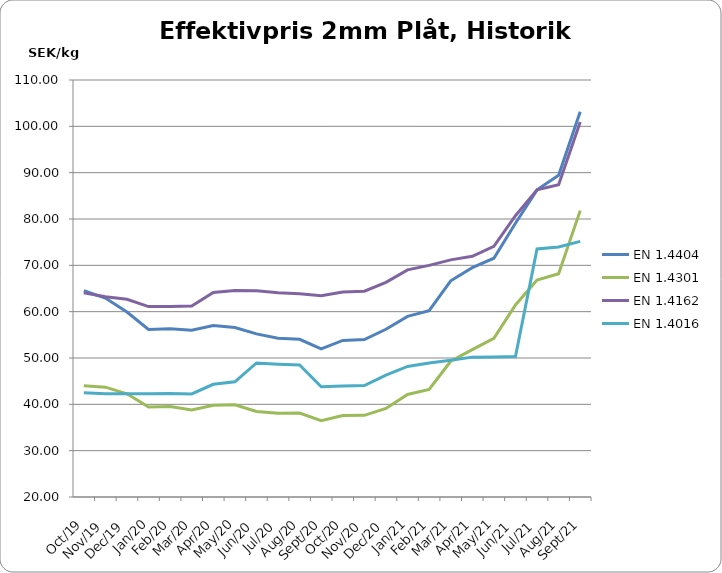
| Category | EN 1.4404 | EN 1.4301 | EN 1.4162  | EN 1.4016 |
|---|---|---|---|---|
| 2019-10-01 | 64.51 | 44.02 | 64.06 | 42.48 |
| 2019-11-01 | 62.95 | 43.71 | 63.23 | 42.31 |
| 2019-12-01 | 59.92 | 42.28 | 62.66 | 42.27 |
| 2020-01-01 | 56.17 | 39.44 | 61.09 | 42.3 |
| 2020-02-01 | 56.29 | 39.51 | 61.13 | 42.35 |
| 2020-03-01 | 56.011 | 38.762 | 61.207 | 42.238 |
| 2020-04-01 | 56.99 | 39.78 | 64.12 | 44.32 |
| 2020-05-01 | 56.561 | 39.922 | 64.555 | 44.865 |
| 2020-06-01 | 55.205 | 38.457 | 64.504 | 48.924 |
| 2020-07-01 | 54.28 | 38.09 | 64.1 | 48.67 |
| 2020-08-01 | 54.032 | 38.136 | 63.889 | 48.499 |
| 2020-09-01 | 51.982 | 36.492 | 63.459 | 43.787 |
| 2020-10-01 | 53.8 | 37.597 | 64.242 | 43.938 |
| 2020-11-01 | 53.982 | 37.627 | 64.412 | 44.061 |
| 2020-12-01 | 56.202 | 39.117 | 66.315 | 46.295 |
| 2021-01-01 | 58.983 | 42.129 | 69.024 | 48.184 |
| 2021-02-01 | 60.225 | 43.204 | 69.988 | 48.927 |
| 2021-03-01 | 66.669 | 49.29 | 71.179 | 49.506 |
| 2021-04-01 | 69.492 | 51.816 | 71.943 | 50.186 |
| 2021-05-01 | 71.536 | 54.26 | 74.099 | 50.223 |
| 2021-06-01 | 79.083 | 61.461 | 80.71 | 50.323 |
| 2021-07-01 | 86.292 | 66.826 | 86.308 | 73.542 |
| 2021-08-01 | 89.42 | 68.2 | 87.42 | 73.98 |
| 2021-09-01 | 103.148 | 81.81 | 100.943 | 75.172 |